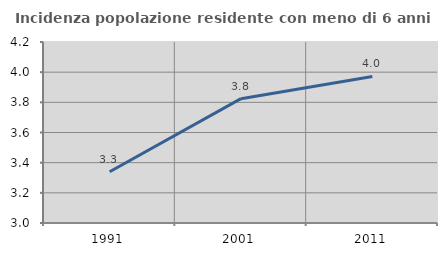
| Category | Incidenza popolazione residente con meno di 6 anni |
|---|---|
| 1991.0 | 3.34 |
| 2001.0 | 3.824 |
| 2011.0 | 3.971 |